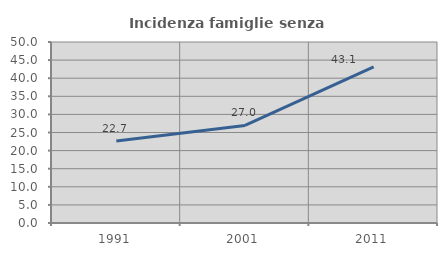
| Category | Incidenza famiglie senza nuclei |
|---|---|
| 1991.0 | 22.654 |
| 2001.0 | 26.95 |
| 2011.0 | 43.129 |